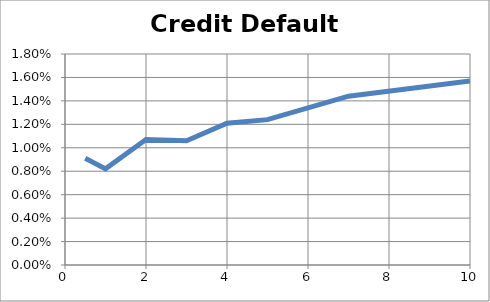
| Category | CDS Spread |
|---|---|
| 0.5 | 0.009 |
| 1.0 | 0.008 |
| 2.0 | 0.011 |
| 3.0 | 0.011 |
| 4.0 | 0.012 |
| 5.0 | 0.012 |
| 7.0 | 0.014 |
| 10.0 | 0.016 |